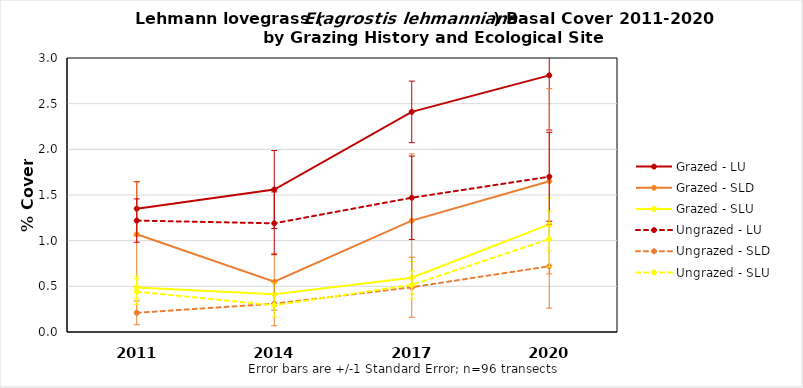
| Category | Grazed - LU | Grazed - SLD | Grazed - SLU | Ungrazed - LU | Ungrazed - SLD | Ungrazed - SLU |
|---|---|---|---|---|---|---|
| 2011.0 | 1.35 | 1.07 | 0.488 | 1.22 | 0.21 | 0.442 |
| 2014.0 | 1.56 | 0.55 | 0.413 | 1.19 | 0.31 | 0.292 |
| 2017.0 | 2.41 | 1.22 | 0.594 | 1.47 | 0.49 | 0.515 |
| 2020.0 | 2.81 | 1.65 | 1.179 | 1.7 | 0.72 | 1.017 |